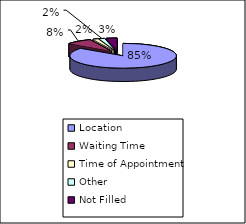
| Category | Why did you choose Oakwood for your surgery |
|---|---|
| Location | 52 |
| Waiting Time | 5 |
| Time of Appointment | 1 |
| Other | 1 |
| Not Filled | 2 |